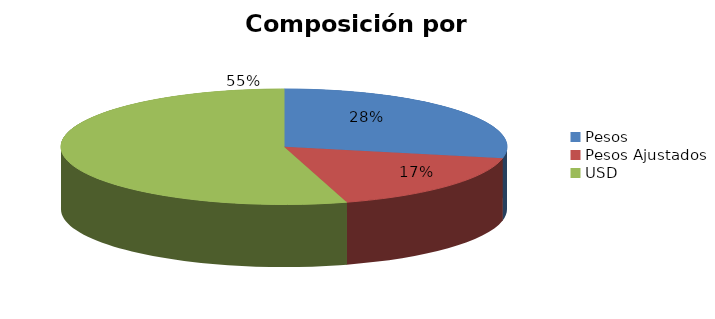
| Category | % | Millones ARS |
|---|---|---|
| Pesos | 0.282 | 16211.293 |
| Pesos Ajustados | 0.173 | 9917.339 |
| USD | 0.545 | 31348.942 |